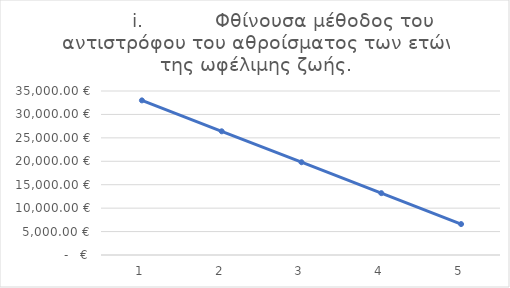
| Category |         i.            Φθίνουσα μέθοδος του αντιστρόφου του αθροίσματος των ετών της ωφέλιμης ζωής. |
|---|---|
| 1.0 | 33000 |
| 2.0 | 26400 |
| 3.0 | 19800 |
| 4.0 | 13200 |
| 5.0 | 6600 |